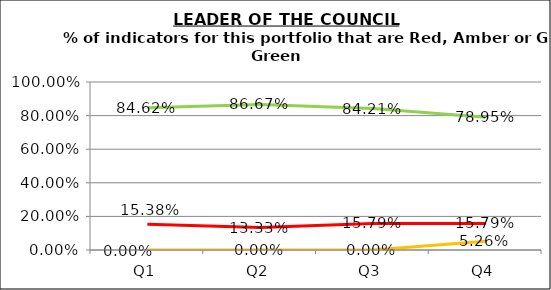
| Category | Green | Amber | Red |
|---|---|---|---|
| Q1 | 0.846 | 0 | 0.154 |
| Q2 | 0.867 | 0 | 0.133 |
| Q3 | 0.842 | 0 | 0.158 |
| Q4 | 0.789 | 0.053 | 0.158 |